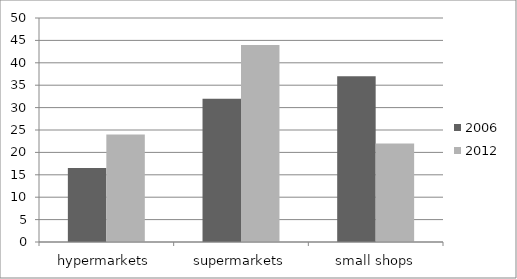
| Category | 2006 | 2012 |
|---|---|---|
| hypermarkets | 16.5 | 24 |
| supermarkets | 32 | 44 |
| small shops | 37 | 22 |